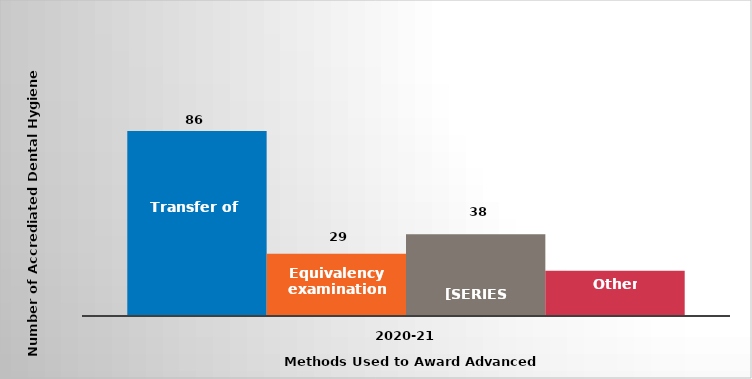
| Category | Transfer of credit | Equivalency examinations | Challenge examinations | Other |
|---|---|---|---|---|
| 2020-21 | 86 | 29 | 38 | 21 |